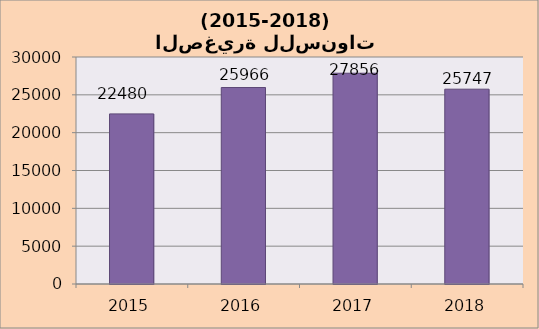
| Category | عـدد المنشات الصغيرة |
|---|---|
| 2015.0 | 22480 |
| 2016.0 | 25966 |
| 2017.0 | 27856 |
| 2018.0 | 25747 |